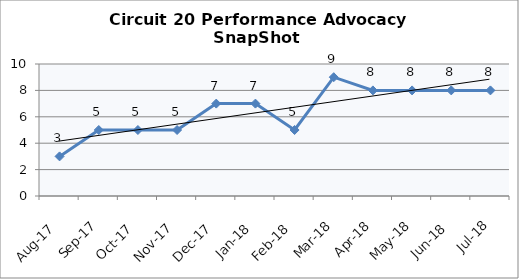
| Category | Circuit 20 |
|---|---|
| Aug-17 | 3 |
| Sep-17 | 5 |
| Oct-17 | 5 |
| Nov-17 | 5 |
| Dec-17 | 7 |
| Jan-18 | 7 |
| Feb-18 | 5 |
| Mar-18 | 9 |
| Apr-18 | 8 |
| May-18 | 8 |
| Jun-18 | 8 |
| Jul-18 | 8 |